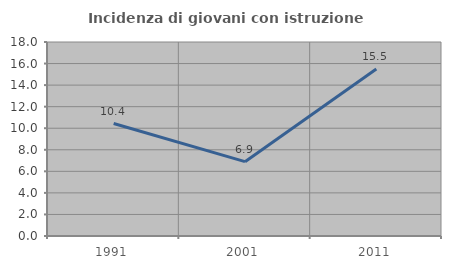
| Category | Incidenza di giovani con istruzione universitaria |
|---|---|
| 1991.0 | 10.435 |
| 2001.0 | 6.897 |
| 2011.0 | 15.493 |